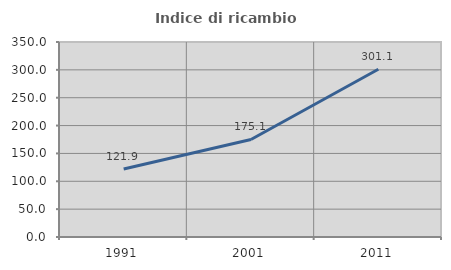
| Category | Indice di ricambio occupazionale  |
|---|---|
| 1991.0 | 121.902 |
| 2001.0 | 175.099 |
| 2011.0 | 301.093 |